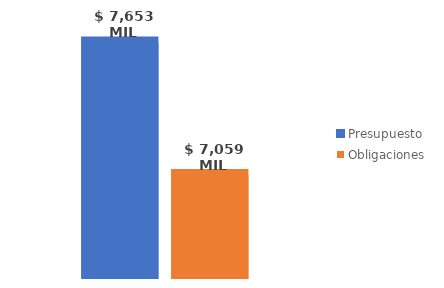
| Category | Presupuesto | Obligaciones |
|---|---|---|
| Total | 7652692185106.118 | 7058866400755.949 |